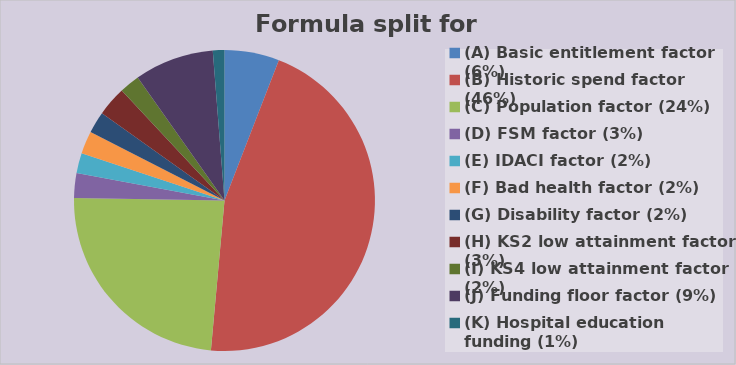
| Category | Series 0 |
|---|---|
| (A) Basic entitlement factor (6%) | 1032000 |
| (B) Historic spend factor (46%) | 7994160.738 |
| (C) Population factor (24%) | 4181739.103 |
| (D) FSM factor (3%) | 465890.355 |
| (E) IDACI factor (2%) | 378598.625 |
| (F) Bad health factor (2%) | 429009.215 |
| (G) Disability factor (2%) | 407771.071 |
| (H) KS2 low attainment factor (3%) | 558350.895 |
| (I) KS4 low attainment factor (2%) | 381918.043 |
| (J) Funding floor factor (9%) | 1498351.606 |
| (K) Hospital education funding (1%) | 218387.25 |